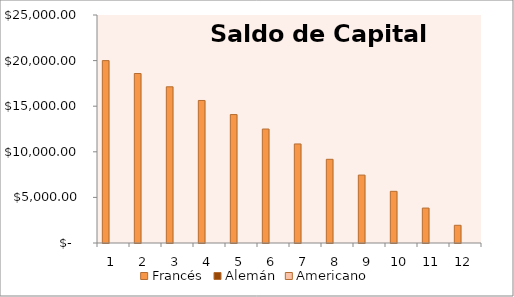
| Category | Francés | Alemán | Americano |
|---|---|---|---|
| 1.0 | 20000 |  |  |
| 2.0 | 18584.074 |  |  |
| 3.0 | 17126.849 |  |  |
| 4.0 | 15627.123 |  |  |
| 5.0 | 14083.654 |  |  |
| 6.0 | 12495.168 |  |  |
| 7.0 | 10860.35 |  |  |
| 8.0 | 9177.851 |  |  |
| 9.0 | 7446.278 |  |  |
| 10.0 | 5664.202 |  |  |
| 11.0 | 3830.148 |  |  |
| 12.0 | 1942.601 |  |  |